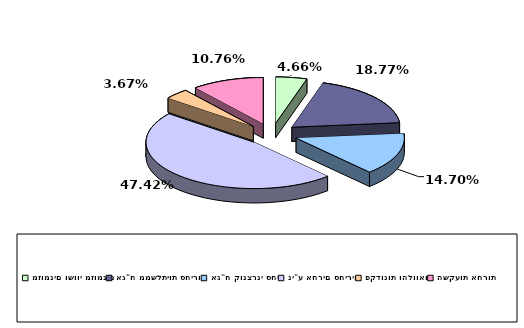
| Category | Series 0 |
|---|---|
| מזומנים ושווי מזומנים | 0.047 |
| אג"ח ממשלתיות סחירות | 0.188 |
| אג"ח קונצרני סחיר | 0.147 |
| ני"ע אחרים סחירים | 0.474 |
| פקדונות והלוואות | 0.037 |
| השקעות אחרות | 0.108 |